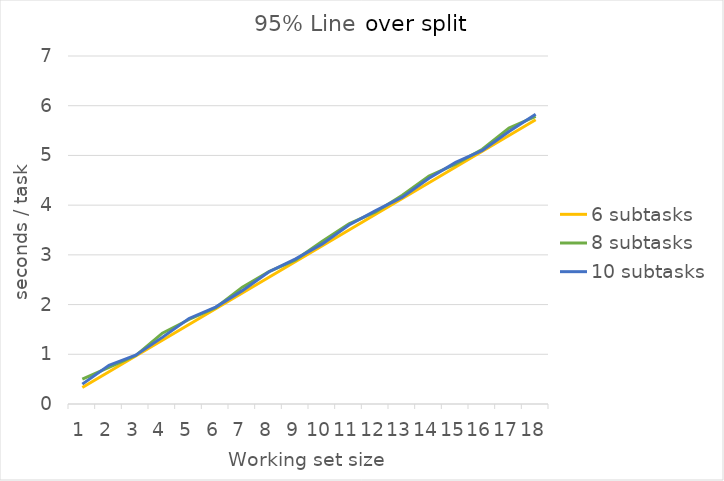
| Category | 6 subtasks | 8 subtasks | 10 subtasks |
|---|---|---|---|
| 0 | 0.333 | 0.5 | 0.4 |
| 1 | 0.65 | 0.738 | 0.78 |
| 2 | 0.967 | 0.975 | 0.98 |
| 3 | 1.283 | 1.425 | 1.34 |
| 4 | 1.6 | 1.7 | 1.72 |
| 5 | 1.917 | 1.938 | 1.95 |
| 6 | 2.233 | 2.35 | 2.28 |
| 7 | 2.55 | 2.662 | 2.66 |
| 8 | 2.867 | 2.9 | 2.92 |
| 9 | 3.183 | 3.275 | 3.22 |
| 10 | 3.5 | 3.625 | 3.6 |
| 11 | 3.817 | 3.862 | 3.89 |
| 12 | 4.133 | 4.2 | 4.16 |
| 13 | 4.45 | 4.588 | 4.54 |
| 14 | 4.767 | 4.825 | 4.86 |
| 15 | 5.083 | 5.125 | 5.1 |
| 16 | 5.4 | 5.55 | 5.48 |
| 17 | 5.717 | 5.788 | 5.83 |